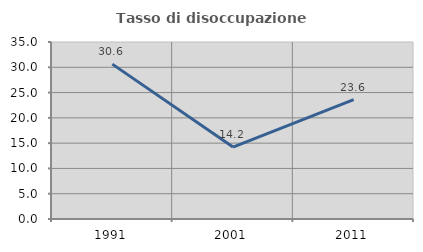
| Category | Tasso di disoccupazione giovanile  |
|---|---|
| 1991.0 | 30.626 |
| 2001.0 | 14.221 |
| 2011.0 | 23.602 |